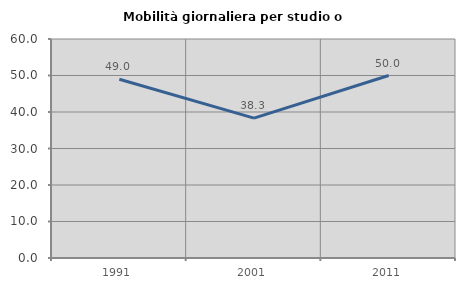
| Category | Mobilità giornaliera per studio o lavoro |
|---|---|
| 1991.0 | 48.958 |
| 2001.0 | 38.333 |
| 2011.0 | 50 |